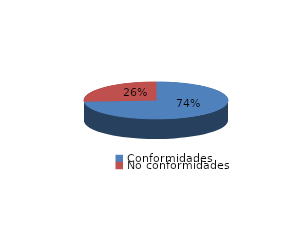
| Category | Series 0 |
|---|---|
| Conformidades | 9843 |
| No conformidades | 3493 |